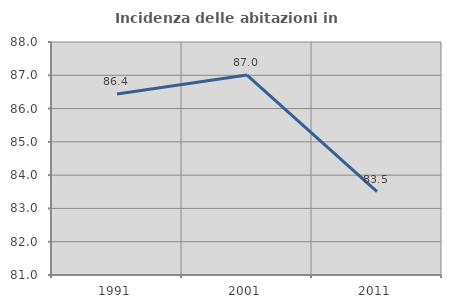
| Category | Incidenza delle abitazioni in proprietà  |
|---|---|
| 1991.0 | 86.441 |
| 2001.0 | 87.006 |
| 2011.0 | 83.505 |